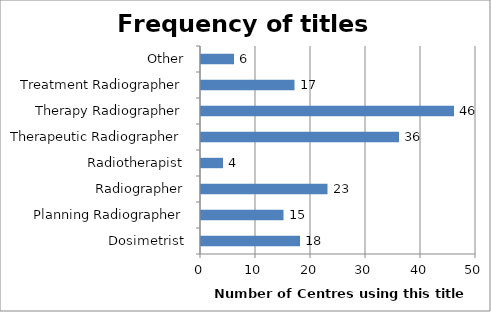
| Category | Number of centres using this title |
|---|---|
| Dosimetrist | 18 |
| Planning Radiographer | 15 |
| Radiographer | 23 |
| Radiotherapist | 4 |
| Therapeutic Radiographer | 36 |
| Therapy Radiographer | 46 |
| Treatment Radiographer | 17 |
| Other | 6 |